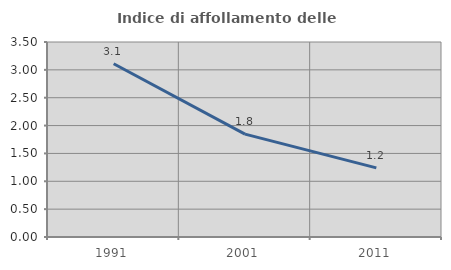
| Category | Indice di affollamento delle abitazioni  |
|---|---|
| 1991.0 | 3.109 |
| 2001.0 | 1.846 |
| 2011.0 | 1.24 |